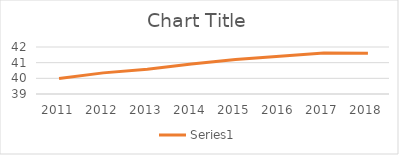
| Category | Series 1 |
|---|---|
| 2011.0 | 39.988 |
| 2012.0 | 40.349 |
| 2013.0 | 40.581 |
| 2014.0 | 40.92 |
| 2015.0 | 41.202 |
| 2016.0 | 41.408 |
| 2017.0 | 41.614 |
| 2018.0 | 41.596 |